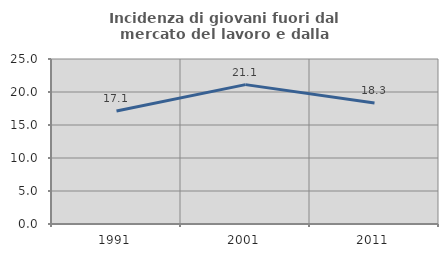
| Category | Incidenza di giovani fuori dal mercato del lavoro e dalla formazione  |
|---|---|
| 1991.0 | 17.132 |
| 2001.0 | 21.116 |
| 2011.0 | 18.321 |